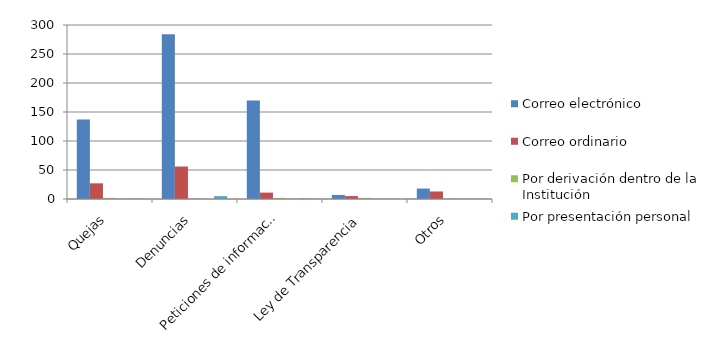
| Category | Correo electrónico  | Correo ordinario | Por derivación dentro de la Institución | Por FAX | Por presentación personal |
|---|---|---|---|---|---|
| Quejas | 137 | 27 | 2 | 0 | 1 |
| Denuncias | 284 | 56 | 1 | 0 | 5 |
| Peticiones de información | 170 | 11 | 2 | 0 | 1 |
| Ley de Transparencia | 7 | 5 | 2 | 0 | 0 |
| Otros | 18 | 13 | 1 | 0 | 0 |